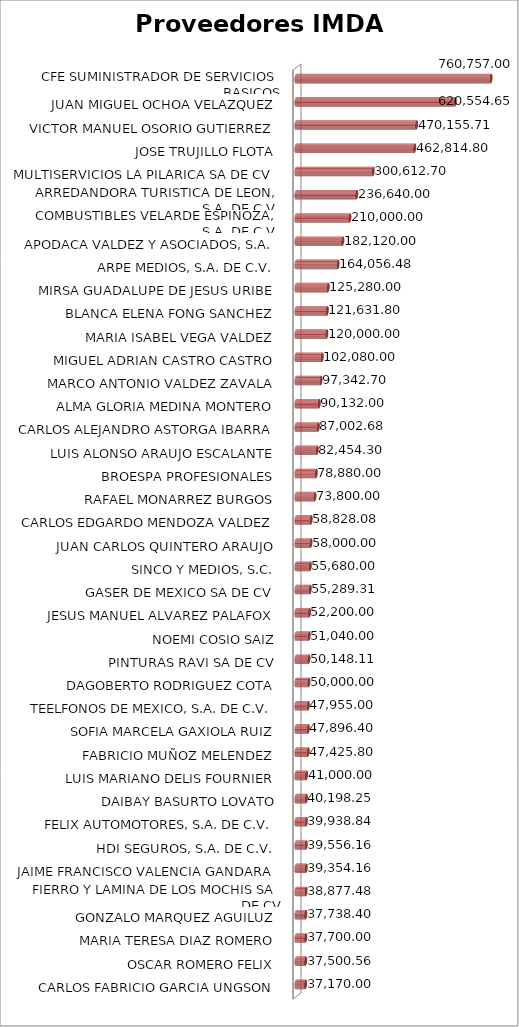
| Category | Suma |
|---|---|
| CARLOS FABRICIO GARCIA UNGSON | 37170 |
| OSCAR ROMERO FELIX | 37500.56 |
| MARIA TERESA DIAZ ROMERO | 37700 |
| GONZALO MARQUEZ AGUILUZ | 37738.4 |
| FIERRO Y LAMINA DE LOS MOCHIS SA DE CV | 38877.48 |
| JAIME FRANCISCO VALENCIA GANDARA | 39354.16 |
| HDI SEGUROS, S.A. DE C.V. | 39556.16 |
| FELIX AUTOMOTORES, S.A. DE C.V. | 39938.84 |
| DAIBAY BASURTO LOVATO | 40198.25 |
| LUIS MARIANO DELIS FOURNIER | 41000 |
| FABRICIO MUÑOZ MELENDEZ | 47425.8 |
| SOFIA MARCELA GAXIOLA RUIZ | 47896.4 |
| TEELFONOS DE MEXICO, S.A. DE C.V. | 47955 |
| DAGOBERTO RODRIGUEZ COTA | 50000 |
| PINTURAS RAVI SA DE CV | 50148.11 |
| NOEMI COSIO SAIZ | 51040 |
| JESUS MANUEL ALVAREZ PALAFOX | 52200 |
| GASER DE MEXICO SA DE CV | 55289.31 |
| SINCO Y MEDIOS, S.C. | 55680 |
| JUAN CARLOS QUINTERO ARAUJO | 58000 |
| CARLOS EDGARDO MENDOZA VALDEZ | 58828.08 |
| RAFAEL MONARREZ BURGOS | 73800 |
| BROESPA PROFESIONALES | 78880 |
| LUIS ALONSO ARAUJO ESCALANTE | 82454.3 |
| CARLOS ALEJANDRO ASTORGA IBARRA | 87002.68 |
| ALMA GLORIA MEDINA MONTERO | 90132 |
| MARCO ANTONIO VALDEZ ZAVALA | 97342.7 |
| MIGUEL ADRIAN CASTRO CASTRO | 102080 |
| MARIA ISABEL VEGA VALDEZ | 120000 |
| BLANCA ELENA FONG SANCHEZ | 121631.8 |
| MIRSA GUADALUPE DE JESUS URIBE | 125280 |
| ARPE MEDIOS, S.A. DE C.V. | 164056.48 |
| APODACA VALDEZ Y ASOCIADOS, S.A. | 182120 |
| COMBUSTIBLES VELARDE ESPINOZA, S.A. DE C.V. | 210000 |
| ARREDANDORA TURISTICA DE LEON, S.A. DE C.V. | 236640 |
| MULTISERVICIOS LA PILARICA SA DE CV | 300612.7 |
| JOSE TRUJILLO FLOTA | 462814.8 |
| VICTOR MANUEL OSORIO GUTIERREZ | 470155.71 |
| JUAN MIGUEL OCHOA VELAZQUEZ | 620554.65 |
| CFE SUMINISTRADOR DE SERVICIOS BASICOS | 760757 |